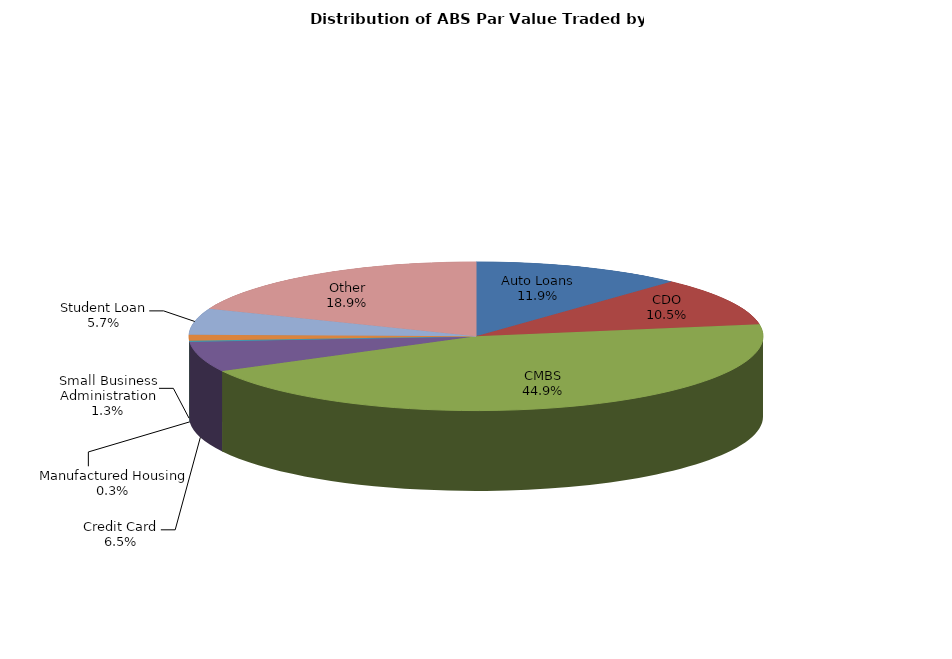
| Category | Series 0 |
|---|---|
| Auto Loans | 635339982.253 |
| CDO | 561650615.671 |
| CMBS | 2397718510.194 |
| Credit Card | 348114001.992 |
| Manufactured Housing | 13622347.341 |
| Small Business Administration | 69916466.587 |
| Student Loan | 305889996.222 |
| Other | 1012637461.55 |